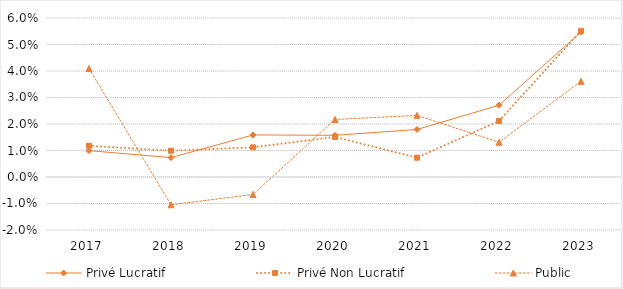
| Category | Privé Lucratif | Privé Non Lucratif | Public |
|---|---|---|---|
| 2017 | 0.01 | 0.012 | 0.041 |
| 2018 | 0.007 | 0.01 | -0.01 |
| 2019 | 0.016 | 0.011 | -0.007 |
| 2020 | 0.016 | 0.015 | 0.022 |
| 2021 | 0.018 | 0.007 | 0.023 |
| 2022 | 0.027 | 0.021 | 0.013 |
| 2023 | 0.055 | 0.055 | 0.036 |